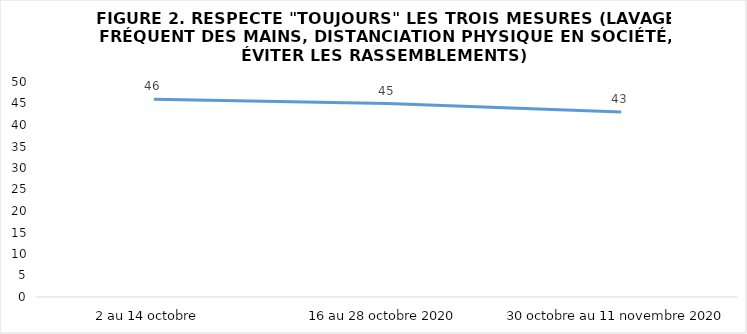
| Category | Series 0 |
|---|---|
| 2 au 14 octobre  | 46 |
| 16 au 28 octobre 2020 | 45 |
| 30 octobre au 11 novembre 2020 | 43 |